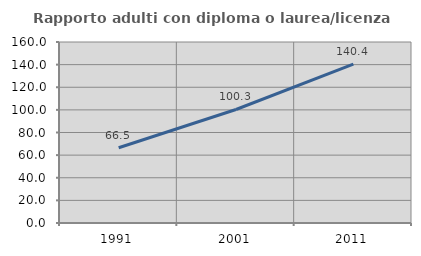
| Category | Rapporto adulti con diploma o laurea/licenza media  |
|---|---|
| 1991.0 | 66.511 |
| 2001.0 | 100.348 |
| 2011.0 | 140.398 |